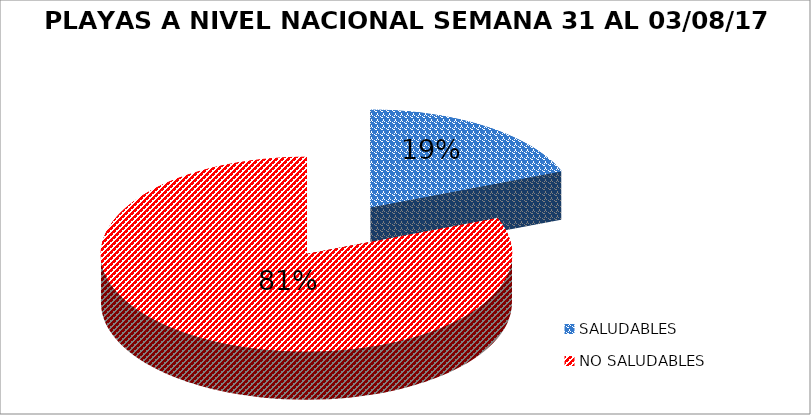
| Category | N.° |
|---|---|
| SALUDABLES | 18 |
| NO SALUDABLES | 77 |